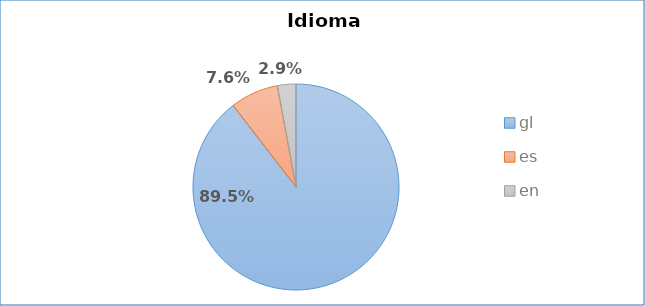
| Category | Idioma empregado |
|---|---|
| gl | 0.895 |
| es | 0.076 |
| en | 0.029 |